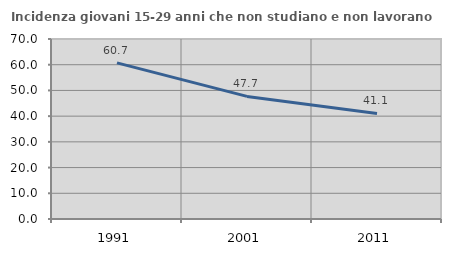
| Category | Incidenza giovani 15-29 anni che non studiano e non lavorano  |
|---|---|
| 1991.0 | 60.719 |
| 2001.0 | 47.681 |
| 2011.0 | 41.068 |